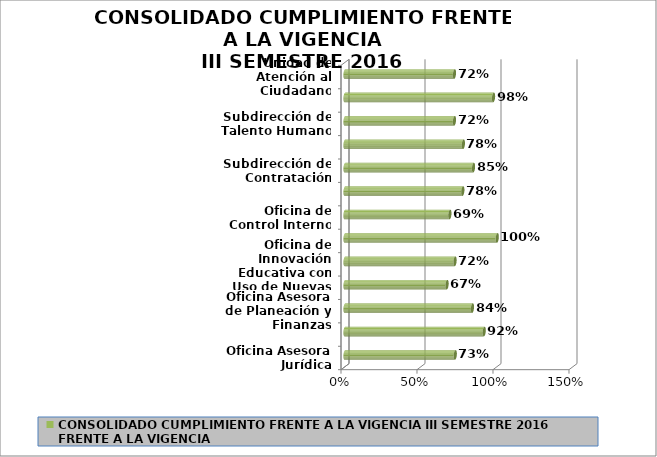
| Category | CONSOLIDADO CUMPLIMIENTO FRENTE A LA VIGENCIA III SEMESTRE 2016 |
|---|---|
| Oficina Asesora Jurídica | 0.726 |
| Oficina Asesora de Comunicaciones | 0.916 |
| Oficina Asesora de Planeación y Finanzas | 0.838 |
| Oficina de Tecnología y Sistemas de Información | 0.671 |
| Oficina de Innovación Educativa con Uso de Nuevas Tecnologías | 0.724 |
| Oficina de Cooperación y Asuntos Internacionales | 1.002 |
| Oficina de Control Interno | 0.69 |
| Subdirección de Gestión Financiera | 0.775 |
| Subdirección de Contratación | 0.846 |
| Subdirección de Gestión Administrativa y Operaciones  | 0.779 |
| Subdirección de Talento Humano | 0.72 |
| Subdirección de Desarrollo Organizacional | 0.977 |
| Unidad de Atención al Ciudadano | 0.72 |